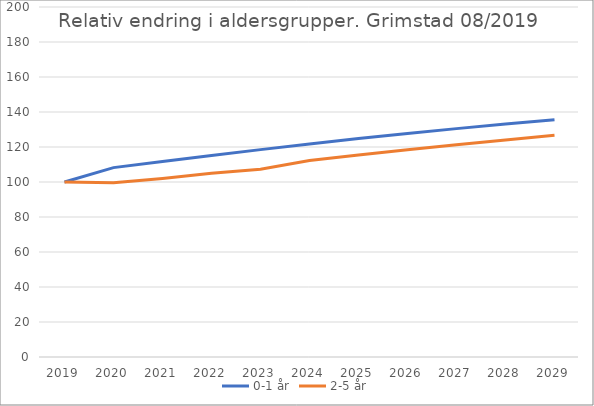
| Category | 0-1 år | 2-5 år |
|---|---|---|
| 2019 | 100 | 100 |
| 2020 | 108.218 | 99.544 |
| 2021 | 111.67 | 102.052 |
| 2022 | 115.109 | 104.983 |
| 2023 | 118.496 | 107.297 |
| 2024 | 121.751 | 112.28 |
| 2025 | 124.832 | 115.369 |
| 2026 | 127.742 | 118.363 |
| 2027 | 130.497 | 121.25 |
| 2028 | 133.082 | 123.995 |
| 2029 | 135.62 | 126.693 |